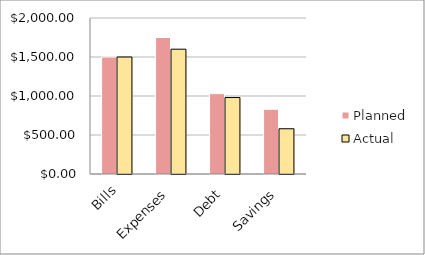
| Category | Planned | Actual |
|---|---|---|
| Bills | 1500 | 1500 |
| Expenses | 1750 | 1600 |
| Debt | 1030 | 980 |
| Savings | 830 | 580 |